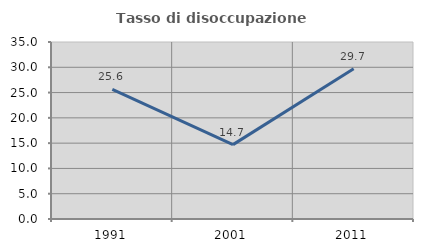
| Category | Tasso di disoccupazione giovanile  |
|---|---|
| 1991.0 | 25.641 |
| 2001.0 | 14.706 |
| 2011.0 | 29.73 |